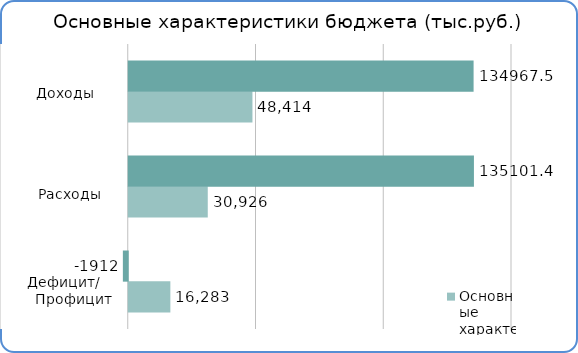
| Category | Факт | План  |
|---|---|---|
| Дефицит | 16283300 | -1912000 |
| Расходы | 30925600 | 135101400 |
| Доходы | 48413800 | 134967500 |